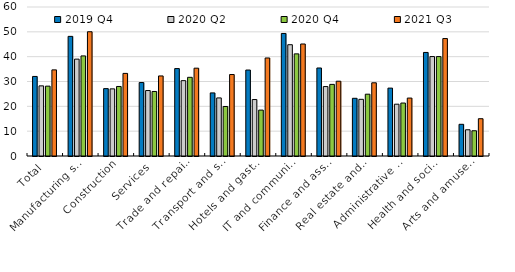
| Category | 2019 Q4 | 2020 Q2 | 2020 Q4 | 2021 Q3 |
|---|---|---|---|---|
| Total | 32.036 | 28.244 | 28.13 | 34.676 |
| Manufacturing sector | 48.177 | 39.005 | 40.303 | 50.039 |
| Construction | 27.135 | 27.031 | 27.996 | 33.261 |
| Services | 29.576 | 26.36 | 25.98 | 32.239 |
| Trade and repair of motor vehicles | 35.207 | 30.344 | 31.682 | 35.365 |
| Transport and stockage | 25.401 | 23.385 | 19.932 | 32.812 |
| Hotels and gastronomy | 34.614 | 22.729 | 18.484 | 39.471 |
| IT and communications | 49.343 | 44.816 | 41.13 | 45.105 |
| Finance and assurance | 35.44 | 27.961 | 28.841 | 30.118 |
| Real estate and scientific services | 23.235 | 22.822 | 24.886 | 29.484 |
| Administrative and support services | 27.334 | 20.862 | 21.329 | 23.328 |
| Health and social work | 41.701 | 40.043 | 40.035 | 47.292 |
| Arts and amusement | 12.765 | 10.562 | 10.166 | 15.014 |